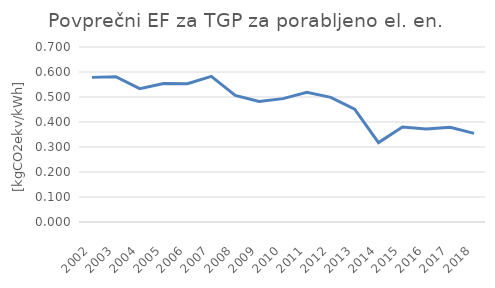
| Category | Series 0 |
|---|---|
| 2002.0 | 0.578 |
| 2003.0 | 0.581 |
| 2004.0 | 0.533 |
| 2005.0 | 0.554 |
| 2006.0 | 0.553 |
| 2007.0 | 0.583 |
| 2008.0 | 0.506 |
| 2009.0 | 0.483 |
| 2010.0 | 0.493 |
| 2011.0 | 0.519 |
| 2012.0 | 0.499 |
| 2013.0 | 0.452 |
| 2014.0 | 0.317 |
| 2015.0 | 0.38 |
| 2016.0 | 0.372 |
| 2017.0 | 0.379 |
| 2018.0 | 0.355 |